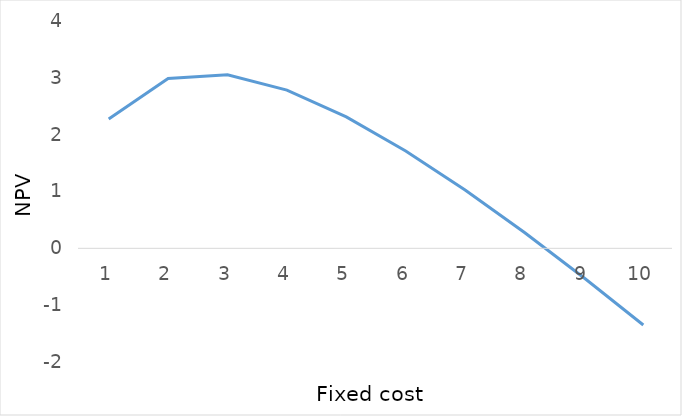
| Category | Series 0 |
|---|---|
| 0 | 2.276 |
| 1 | 2.99 |
| 2 | 3.055 |
| 3 | 2.783 |
| 4 | 2.313 |
| 5 | 1.714 |
| 6 | 1.027 |
| 7 | 0.277 |
| 8 | -0.518 |
| 9 | -1.349 |